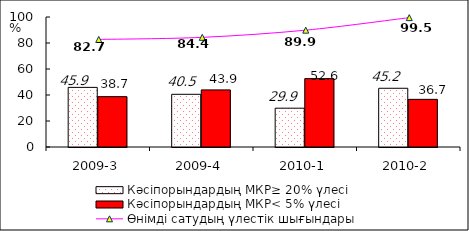
| Category | Кәсіпорындардың МКР≥ 20% үлесі | Кәсіпорындардың МКР< 5% үлесі |
|---|---|---|
| 2009-3 | 45.858 | 38.729 |
| 2009-4 | 40.531 | 43.92 |
| 2010-1 | 29.852 | 52.593 |
| 2010-2 | 45.173 | 36.652 |